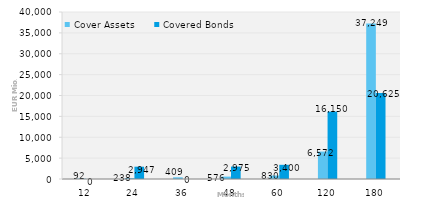
| Category | Cover Assets | Covered Bonds |
|---|---|---|
| 12.0 | 91.735 | 0 |
| 24.0 | 237.961 | 2947 |
| 36.0 | 409.333 | 0 |
| 48.0 | 576.499 | 2975 |
| 60.0 | 830.095 | 3400 |
| 120.0 | 6572.217 | 16150 |
| 180.0 | 37249.393 | 20625 |